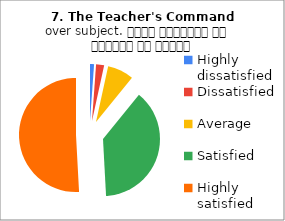
| Category | 7. The Teacher's Command over subject. विषय अवधारणा पर शिक्षक का ज्ञान |
|---|---|
| Highly dissatisfied | 2 |
| Dissatisfied | 4 |
| Average | 13 |
| Satisfied | 67 |
| Highly satisfied | 89 |